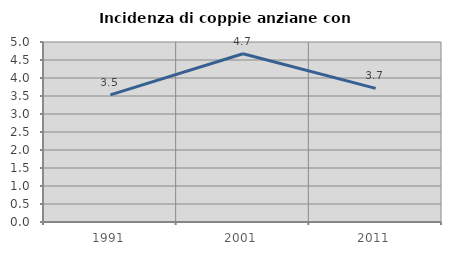
| Category | Incidenza di coppie anziane con figli |
|---|---|
| 1991.0 | 3.529 |
| 2001.0 | 4.673 |
| 2011.0 | 3.713 |